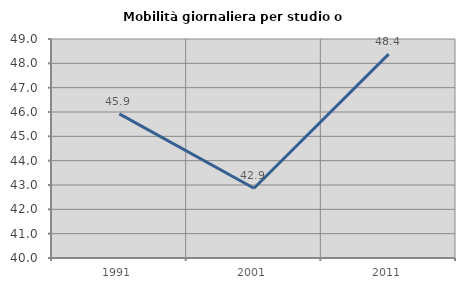
| Category | Mobilità giornaliera per studio o lavoro |
|---|---|
| 1991.0 | 45.922 |
| 2001.0 | 42.866 |
| 2011.0 | 48.38 |